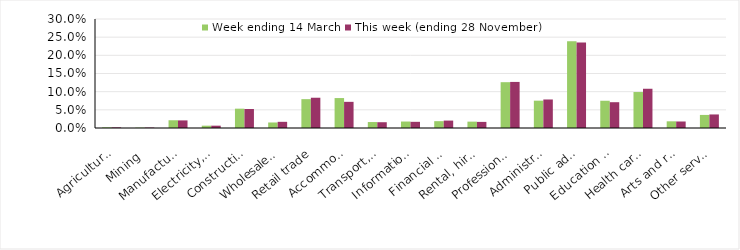
| Category | Week ending 14 March | This week (ending 28 November) |
|---|---|---|
| Agriculture, forestry and fishing | 0.002 | 0.002 |
| Mining | 0.001 | 0.001 |
| Manufacturing | 0.021 | 0.021 |
| Electricity, gas, water and waste services | 0.006 | 0.006 |
| Construction | 0.053 | 0.052 |
| Wholesale trade | 0.015 | 0.017 |
| Retail trade | 0.079 | 0.083 |
| Accommodation and food services | 0.082 | 0.072 |
| Transport, postal and warehousing | 0.016 | 0.016 |
| Information media and telecommunications | 0.018 | 0.017 |
| Financial and insurance services | 0.019 | 0.02 |
| Rental, hiring and real estate services | 0.018 | 0.017 |
| Professional, scientific and technical services | 0.126 | 0.127 |
| Administrative and support services | 0.075 | 0.078 |
| Public administration and safety | 0.239 | 0.236 |
| Education and training | 0.075 | 0.071 |
| Health care and social assistance | 0.099 | 0.108 |
| Arts and recreation services | 0.018 | 0.018 |
| Other services | 0.036 | 0.037 |